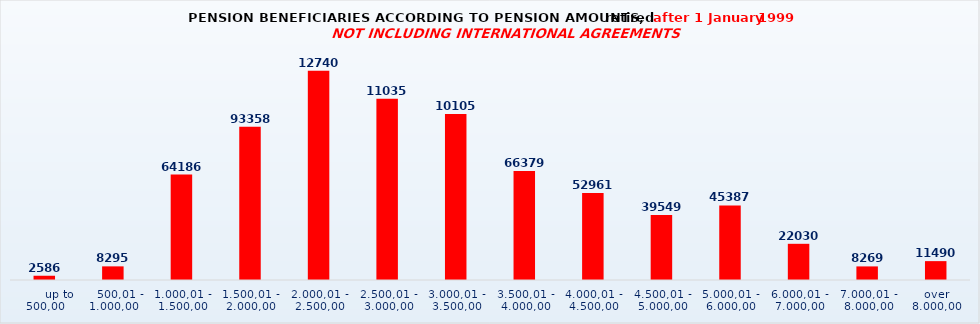
| Category | Series 0 |
|---|---|
|       up to 500,00 | 2586 |
|    500,01 - 1.000,00 | 8295 |
| 1.000,01 - 1.500,00 | 64186 |
| 1.500,01 - 2.000,00 | 93358 |
| 2.000,01 - 2.500,00 | 127403 |
| 2.500,01 - 3.000,00 | 110351 |
| 3.000,01 - 3.500,00 | 101054 |
| 3.500,01 - 4.000,00 | 66379 |
| 4.000,01 - 4.500,00 | 52961 |
| 4.500,01 - 5.000,00 | 39549 |
| 5.000,01 - 6.000,00 | 45387 |
| 6.000,01 - 7.000,00 | 22030 |
| 7.000,01 - 8.000,00 | 8269 |
| over 8.000,00 | 11490 |